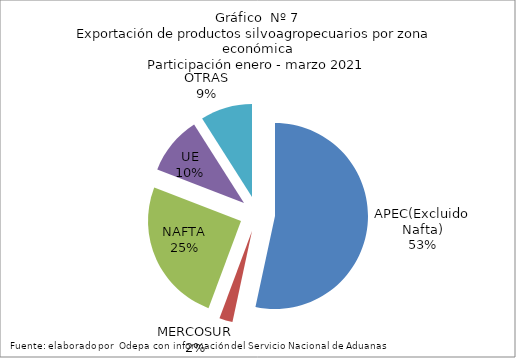
| Category | Series 0 |
|---|---|
| APEC(Excluido Nafta) | 2669640.856 |
| MERCOSUR | 115668.334 |
| NAFTA | 1260118.698 |
| UE | 505823.268 |
| OTRAS | 450787.844 |